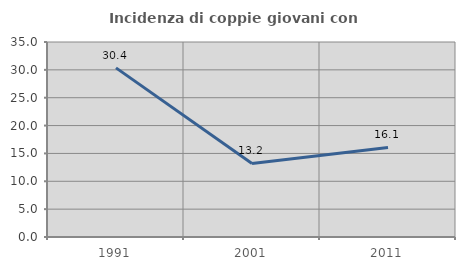
| Category | Incidenza di coppie giovani con figli |
|---|---|
| 1991.0 | 30.357 |
| 2001.0 | 13.208 |
| 2011.0 | 16.071 |